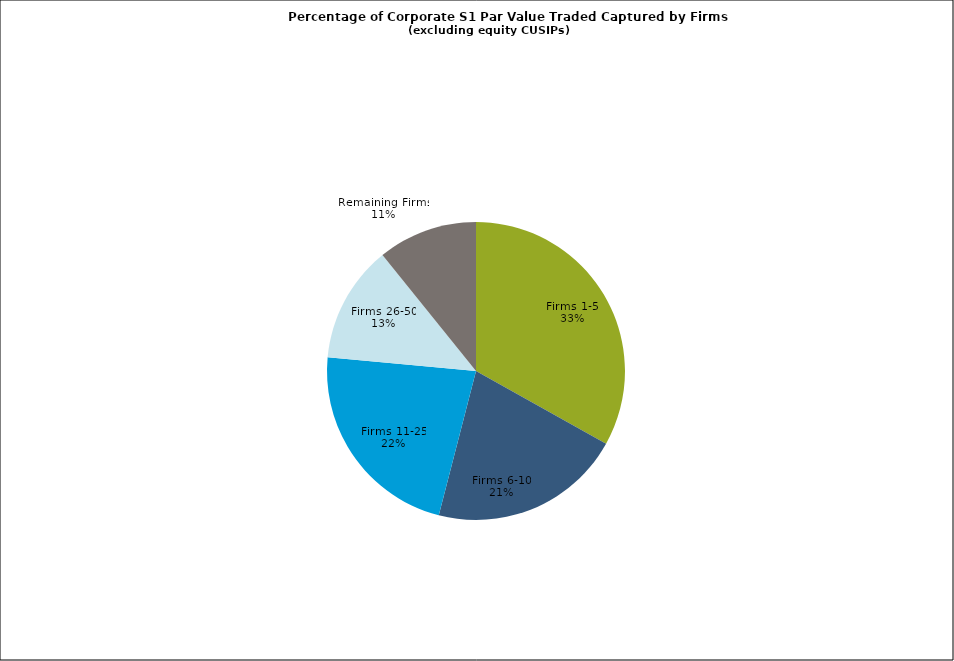
| Category | Series 0 |
|---|---|
| Firms 1-5 | 0.331 |
| Firms 6-10 | 0.209 |
| Firms 11-25 | 0.224 |
| Firms 26-50 | 0.127 |
| Remaining Firms | -0.108 |